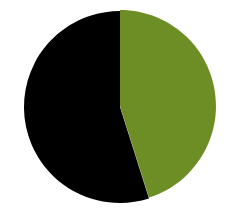
| Category | Series 0 |
|---|---|
| 0 | 0.451 |
| 1 | 0.549 |